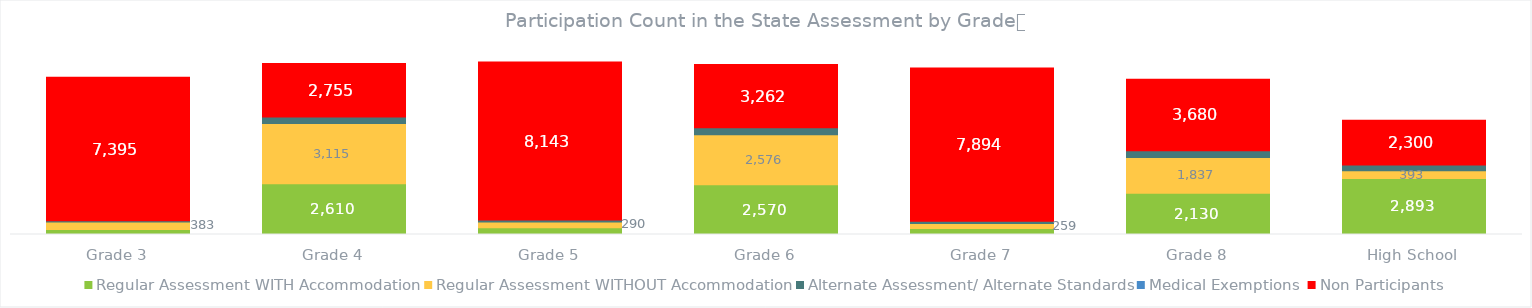
| Category | Regular Assessment WITH Accommodation | Regular Assessment WITHOUT Accommodation | Alternate Assessment/ Alternate Standards | Medical Exemptions | Non Participants |
|---|---|---|---|---|---|
| Grade 3 | 255 | 383 | 68 | 0 | 7395 |
| Grade 4 | 2610 | 3115 | 329 | 0 | 2755 |
| Grade 5 | 353 | 290 | 105 | 0 | 8143 |
| Grade 6 | 2570 | 2576 | 358 | 0 | 3262 |
| Grade 7 | 311 | 259 | 116 | 0 | 7894 |
| Grade 8 | 2130 | 1837 | 354 | 0 | 3680 |
| High School | 2893 | 393 | 301 | 0 | 2300 |